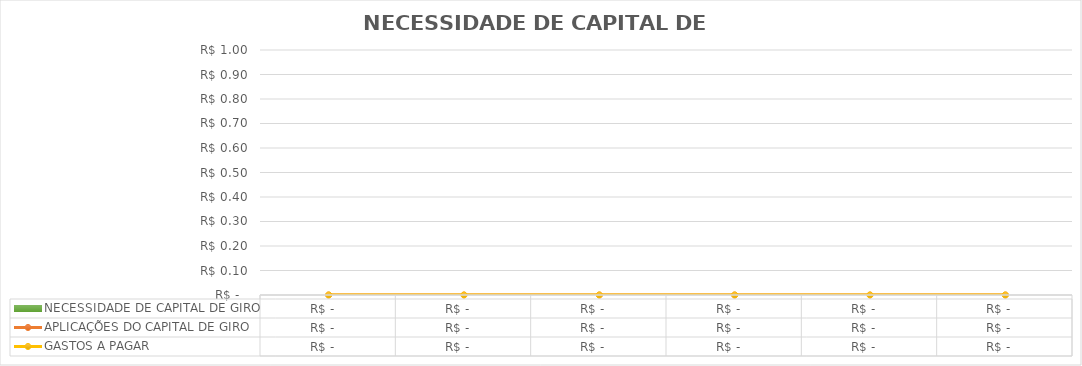
| Category | NECESSIDADE DE CAPITAL DE GIRO |
|---|---|
|  | 0 |
|  | 0 |
|  | 0 |
|  | 0 |
|  | 0 |
|  | 0 |